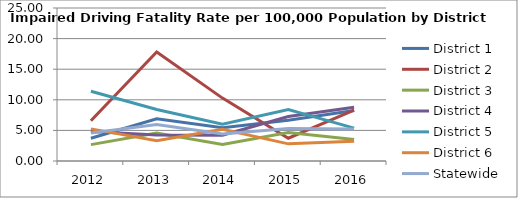
| Category | District 1 | District 2 | District 3 | District 4 | District 5 | District 6 | Statewide |
|---|---|---|---|---|---|---|---|
| 2012.0 | 3.713 | 6.573 | 2.675 | 4.808 | 11.395 | 5.25 | 4.575 |
| 2013.0 | 6.895 | 17.826 | 4.568 | 4.236 | 8.427 | 3.325 | 5.955 |
| 2014.0 | 5.42 | 10.277 | 2.713 | 4.2 | 6.016 | 5.183 | 4.405 |
| 2015.0 | 6.666 | 3.725 | 4.669 | 7.277 | 8.412 | 2.802 | 5.317 |
| 2016.0 | 8.258 | 8.328 | 3.529 | 8.765 | 5.363 | 3.208 | 5.228 |